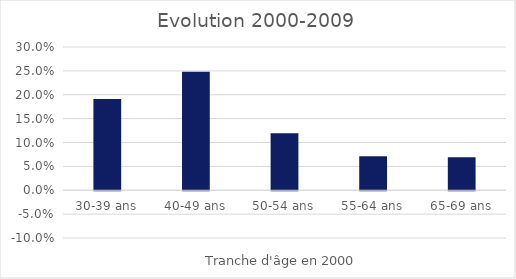
| Category | décennie 2000-2009 |
|---|---|
| 30-39 ans | 0.191 |
| 40-49 ans | 0.248 |
| 50-54 ans | 0.12 |
| 55-64 ans | 0.071 |
| 65-69 ans | 0.069 |